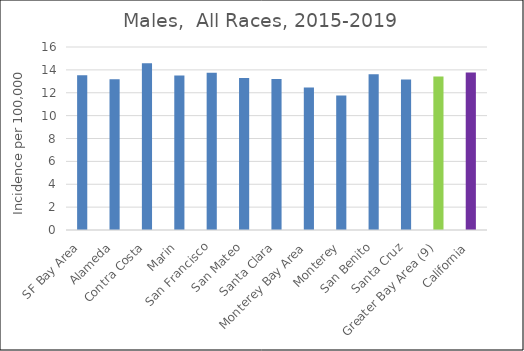
| Category | Male |
|---|---|
| SF Bay Area | 13.54 |
|   Alameda | 13.18 |
|   Contra Costa | 14.57 |
|   Marin | 13.51 |
|   San Francisco | 13.75 |
|   San Mateo | 13.3 |
|   Santa Clara | 13.21 |
| Monterey Bay Area | 12.45 |
|   Monterey | 11.75 |
|   San Benito | 13.62 |
|   Santa Cruz | 13.15 |
| Greater Bay Area (9) | 13.43 |
| California | 13.78 |